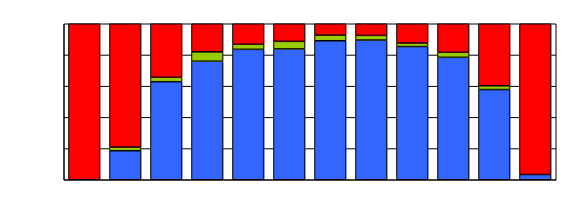
| Category | Series 0 | Series 1 | Series 2 |
|---|---|---|---|
| 0 | 0 | 0 | 128 |
| 1 | 8 | 1 | 34 |
| 2 | 22 | 1 | 12 |
| 3 | 38 | 3 | 9 |
| 4 | 51 | 2 | 8 |
| 5 | 52 | 3 | 7 |
| 6 | 49 | 2 | 4 |
| 7 | 60 | 2 | 5 |
| 8 | 76 | 2 | 11 |
| 9 | 73 | 3 | 17 |
| 10 | 48 | 2 | 33 |
| 11 | 10 | 0 | 287 |